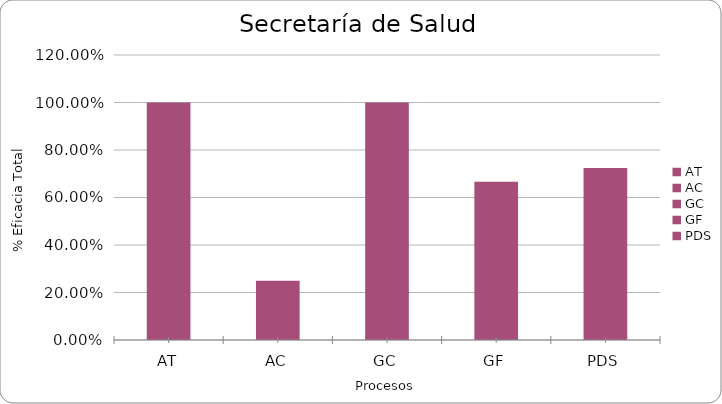
| Category | % Eficacia total |
|---|---|
| AT | 1 |
| AC | 0.25 |
| GC | 1 |
| GF | 0.667 |
| PDS | 0.724 |